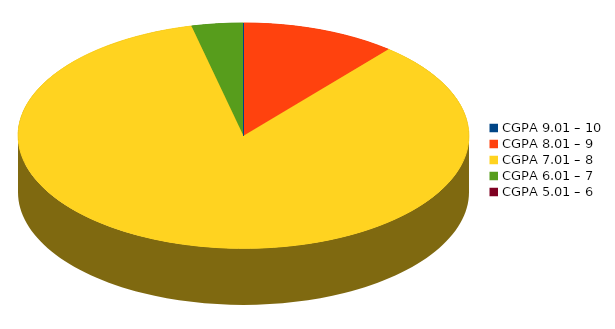
| Category | Number of students |
|---|---|
| CGPA 9.01 – 10 | 0 |
| CGPA 8.01 – 9 | 3 |
| CGPA 7.01 – 8 | 23 |
| CGPA 6.01 – 7 | 1 |
| CGPA 5.01 – 6 | 0 |